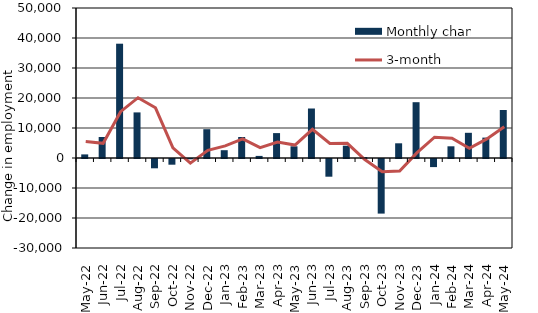
| Category | Monthly change |
|---|---|
| 2022-05-01 | 1200 |
| 2022-06-01 | 7000 |
| 2022-07-01 | 38100 |
| 2022-08-01 | 15200 |
| 2022-09-01 | -3100 |
| 2022-10-01 | -1900 |
| 2022-11-01 | -100 |
| 2022-12-01 | 9600 |
| 2023-01-01 | 2600 |
| 2023-02-01 | 7000 |
| 2023-03-01 | 700 |
| 2023-04-01 | 8300 |
| 2023-05-01 | 3900 |
| 2023-06-01 | 16500 |
| 2023-07-01 | -5900 |
| 2023-08-01 | 4100 |
| 2023-09-01 | 300 |
| 2023-10-01 | -18200 |
| 2023-11-01 | 4900 |
| 2023-12-01 | 18600 |
| 2024-01-01 | -2700 |
| 2024-02-01 | 3900 |
| 2024-03-01 | 8400 |
| 2024-04-01 | 6800 |
| 2024-05-01 | 16000 |